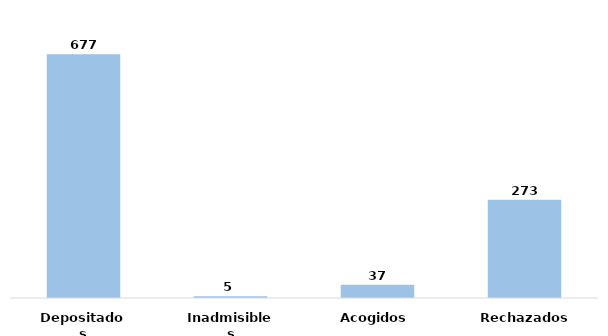
| Category | Series 0 |
|---|---|
| Depositados | 677 |
| Inadmisibles | 5 |
| Acogidos | 37 |
| Rechazados | 273 |